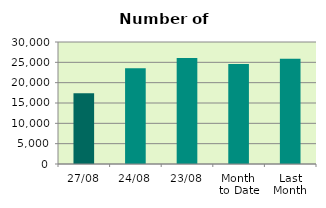
| Category | Series 0 |
|---|---|
| 27/08 | 17392 |
| 24/08 | 23528 |
| 23/08 | 26040 |
| Month 
to Date | 24615.579 |
| Last
Month | 25883.727 |